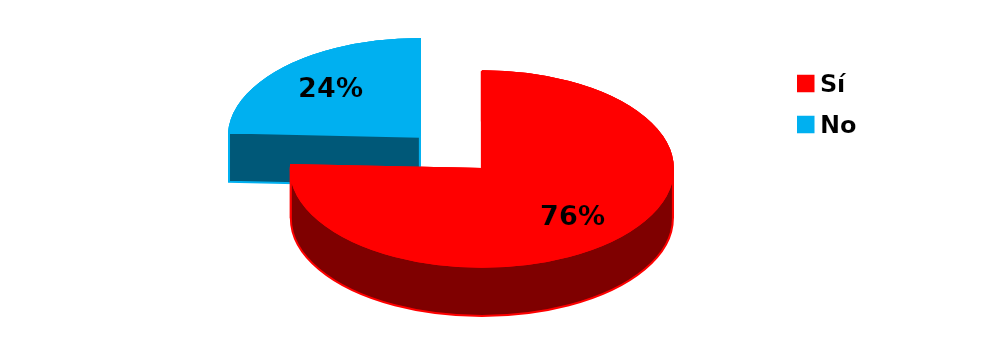
| Category | Series 0 |
|---|---|
| Sí | 84 |
| No | 27 |